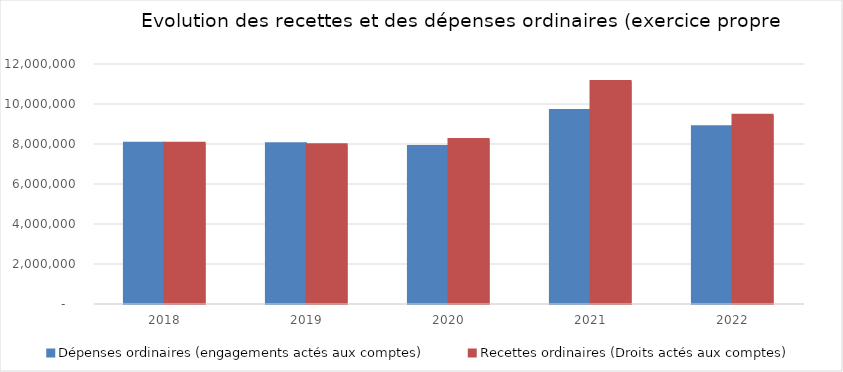
| Category | Dépenses ordinaires (engagements actés aux comptes) | Recettes ordinaires (Droits actés aux comptes) |
|---|---|---|
| 2018.0 | 8031594.19 | 8032885.34 |
| 2019.0 | 8012967.69 | 7963043.07 |
| 2020.0 | 7875435.81 | 8221047.49 |
| 2021.0 | 9670836.16 | 11123711.89 |
| 2022.0 | 8864120.54 | 9442617.26 |